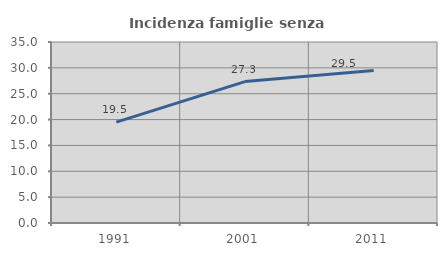
| Category | Incidenza famiglie senza nuclei |
|---|---|
| 1991.0 | 19.518 |
| 2001.0 | 27.344 |
| 2011.0 | 29.5 |